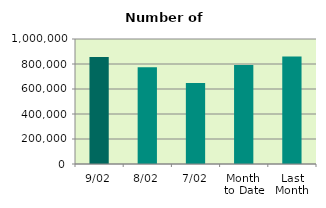
| Category | Series 0 |
|---|---|
| 9/02 | 856128 |
| 8/02 | 773034 |
| 7/02 | 647268 |
| Month 
to Date | 791635.429 |
| Last
Month | 859790.952 |